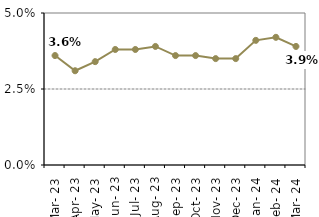
| Category | Series 0 |
|---|---|
| Mar- 23 | 0.036 |
| Apr- 23 | 0.031 |
| May- 23 | 0.034 |
| Jun- 23 | 0.038 |
| Jul- 23 | 0.038 |
| Aug- 23 | 0.039 |
| Sep- 23 | 0.036 |
| Oct- 23 | 0.036 |
| Nov- 23 | 0.035 |
| Dec- 23 | 0.035 |
| Jan- 24 | 0.041 |
| Feb- 24 | 0.042 |
| Mar- 24 | 0.039 |